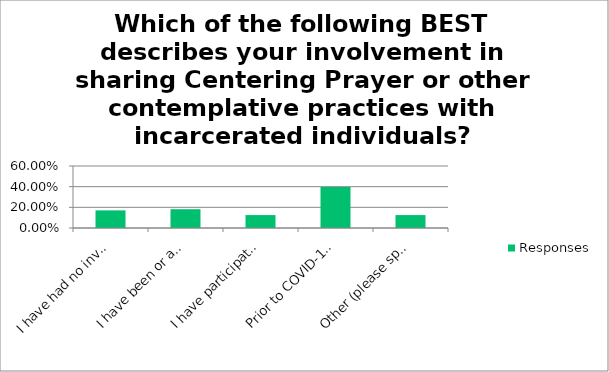
| Category | Responses |
|---|---|
| I have had no involvement but am interested in becoming involved | 0.17 |
| I have been or am involved with incarcerated individuals but not in relation to contemplative practice | 0.182 |
| I have participated in contemplative practice with incarcerated individuals at least once | 0.125 |
| Prior to COVID-19 restrictions, I volunteered regularly with a contemplative group in a correctional facility in my area. | 0.398 |
| Other (please specify) | 0.125 |